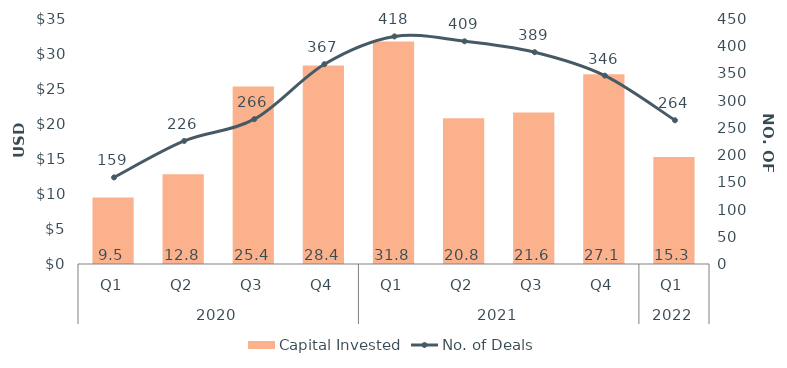
| Category | Capital Invested |
|---|---|
| 0 | 9.486 |
| 1 | 12.817 |
| 2 | 25.353 |
| 3 | 28.354 |
| 4 | 31.803 |
| 5 | 20.826 |
| 6 | 21.633 |
| 7 | 27.092 |
| 8 | 15.298 |